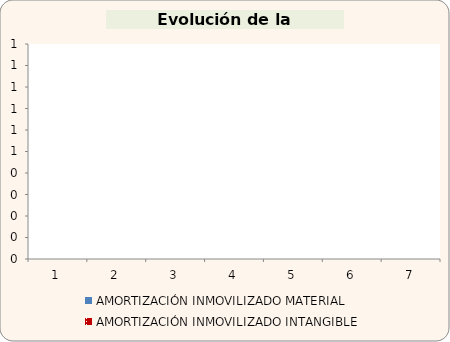
| Category | AMORTIZACIÓN INMOVILIZADO MATERIAL | AMORTIZACIÓN INMOVILIZADO INTANGIBLE |
|---|---|---|
| 0 | 0 | 0 |
| 1 | 0 | 0 |
| 2 | 0 | 0 |
| 3 | 0 | 0 |
| 4 | 0 | 0 |
| 5 | 0 | 0 |
| 6 | 0 | 0 |